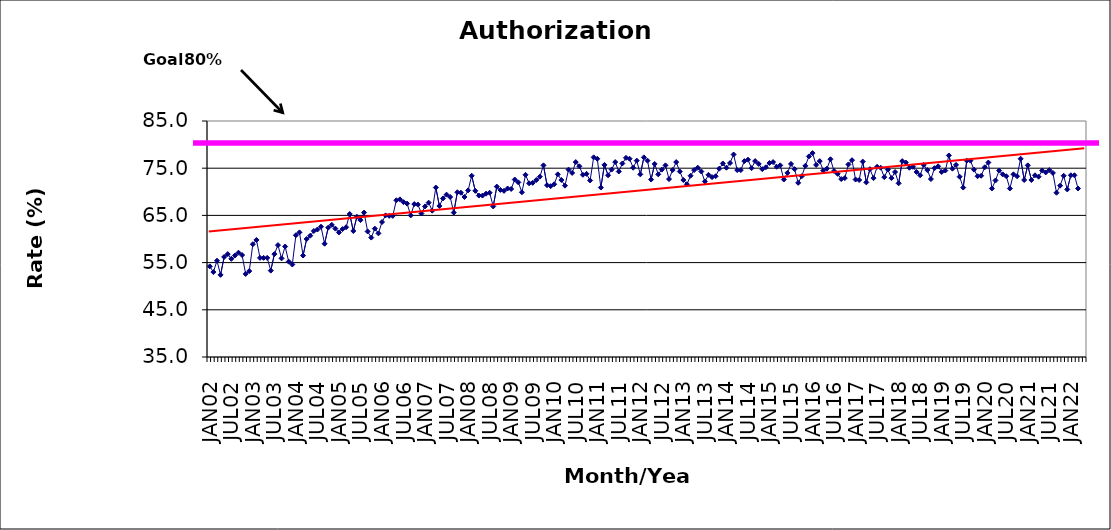
| Category | Series 0 |
|---|---|
| JAN02 | 54.2 |
| FEB02 | 53 |
| MAR02 | 55.4 |
| APR02 | 52.4 |
| MAY02 | 56.2 |
| JUN02 | 56.8 |
| JUL02 | 55.8 |
| AUG02 | 56.5 |
| SEP02 | 57.1 |
| OCT02 | 56.6 |
| NOV02 | 52.6 |
| DEC02 | 53.2 |
| JAN03 | 58.9 |
| FEB03 | 59.8 |
| MAR03 | 56 |
| APR03 | 56 |
| MAY03 | 56 |
| JUN03 | 53.3 |
| JUL03 | 56.8 |
| AUG03 | 58.7 |
| SEP03 | 55.9 |
| OCT03 | 58.4 |
| NOV03 | 55.2 |
| DEC03 | 54.6 |
| JAN04 | 60.8 |
| FEB04 | 61.4 |
| MAR04 | 56.5 |
| APR04 | 60 |
| MAY04 | 60.7 |
| JUN04 | 61.7 |
| JUL04 | 62 |
| AUG04 | 62.6 |
| SEP04 | 59 |
| OCT04 | 62.4 |
| NOV04 | 63 |
| DEC04 | 62.2 |
| JAN05 | 61.4 |
| FEB05 | 62.1 |
| MAR05 | 62.5 |
| APR05 | 65.3 |
| MAY05 | 61.7 |
| JUN05 | 64.7 |
| JUL05 | 64 |
| AUG05 | 65.6 |
| SEP05 | 61.6 |
| OCT05 | 60.3 |
| NOV05 | 62.2 |
| DEC05 | 61.2 |
| JAN06 | 63.6 |
| FEB06 | 65 |
| MAR06 | 64.9 |
| APR06 | 64.9 |
| MAY06 | 68.2 |
| JUN06 | 68.4 |
| JUL06 | 67.8 |
| AUG06 | 67.5 |
| SEP06 | 65 |
| OCT06 | 67.4 |
| NOV06 | 67.3 |
| DEC06 | 65.4 |
| JAN07 | 66.9 |
| FEB07 | 67.7 |
| MAR07 | 66 |
| APR07 | 70.9 |
| MAY07 | 67 |
| JUN07 | 68.6 |
| JUL07 | 69.4 |
| AUG07 | 68.9 |
| SEP07 | 65.6 |
| OCT07 | 69.9 |
| NOV07 | 69.8 |
| DEC07 | 68.9 |
| JAN08 | 70.3 |
| FEB08 | 73.4 |
| MAR08 | 70.2 |
| APR08 | 69.2 |
| MAY08 | 69.2 |
| JUN08 | 69.6 |
| JUL08 | 69.8 |
| AUG08 | 66.9 |
| SEP08 | 71.1 |
| OCT08 | 70.4 |
| NOV08 | 70.2 |
| DEC08 | 70.7 |
| JAN09 | 70.6 |
| FEB09 | 72.6 |
| MAR09 | 72 |
| APR09 | 69.9 |
| MAY09 | 73.6 |
| JUN09 | 71.8 |
| JUL09 | 71.9 |
| AUG09 | 72.5 |
| SEP09 | 73.2 |
| OCT09 | 75.6 |
| NOV09 | 71.4 |
| DEC09 | 71.2 |
| JAN10 | 71.6 |
| FEB10 | 73.7 |
| MAR10 | 72.5 |
| APR10 | 71.3 |
| MAY10 | 74.7 |
| JUN10 | 74 |
| JUL10 | 76.3 |
| AUG10 | 75.4 |
| SEP10 | 73.6 |
| OCT10 | 73.8 |
| NOV10 | 72.4 |
| DEC10 | 77.3 |
| JAN11 | 77 |
| FEB11 | 70.9 |
| MAR11 | 75.7 |
| APR11 | 73.5 |
| MAY11 | 74.7 |
| JUN11 | 76.3 |
| JUL11 | 74.3 |
| AUG11 | 76 |
| SEP11 | 77.2 |
| OCT11 | 77 |
| NOV11 | 75.1 |
| DEC11 | 76.6 |
| JAN12 | 73.7 |
| FEB12 | 77.3 |
| MAR12 | 76.6 |
| APR12 | 72.6 |
| MAY12 | 75.9 |
| JUN12 | 73.7 |
| JUL12 | 74.7 |
| AUG12 | 75.6 |
| SEP12 | 72.7 |
| OCT12 | 74.6 |
| NOV12 | 76.3 |
| DEC12 | 74.3 |
| JAN13 | 72.5 |
| FEB13 | 71.6 |
| MAR13 | 73.4 |
| APR13 | 74.6 |
| MAY13 | 75.1 |
| JUN13 | 74.3 |
| JUL13 | 72.2 |
| AUG13 | 73.6 |
| SEP13 | 73.1 |
| OCT13 | 73.3 |
| NOV13 | 74.9 |
| DEC13 | 76 |
| JAN14 | 75.1 |
| FEB14 | 76.1 |
| MAR14 | 77.9 |
| APR14 | 74.6 |
| MAY14 | 74.6 |
| JUN14 | 76.5 |
| JUL14 | 76.8 |
| AUG14 | 75 |
| SEP14 | 76.5 |
| OCT14 | 75.9 |
| NOV14 | 74.8 |
| DEC14 | 75.2 |
| JAN15 | 76.1 |
| FEB15 | 76.3 |
| MAR15 | 75.3 |
| APR15 | 75.6 |
| MAY15 | 72.6 |
| JUN15 | 74 |
| JUL15 | 75.9 |
| AUG15 | 74.8 |
| SEP15 | 71.9 |
| OCT15 | 73.3 |
| NOV15 | 75.5 |
| DEC15 | 77.5 |
| JAN16 | 78.2 |
| FEB16 | 75.7 |
| MAR16 | 76.5 |
| APR16 | 74.5 |
| MAY16 | 74.9 |
| JUN16 | 76.9 |
| JUL16 | 74.4 |
| AUG16 | 73.8 |
| SEP16 | 72.7 |
| OCT16 | 72.9 |
| NOV16 | 75.8 |
| DEC16 | 76.7 |
| JAN17 | 72.6 |
| FEB17 | 72.5 |
| MAR17 | 76.4 |
| APR17 | 72 |
| MAY17 | 74.8 |
| JUN17 | 72.9 |
| JUL17 | 75.3 |
| AUG17 | 75.1 |
| SEP17 | 73.1 |
| OCT17 | 74.7 |
| NOV17 | 72.9 |
| DEC17 | 74.2 |
| JAN18 | 71.8 |
| FEB18 | 76.5 |
| MAR18 | 76.2 |
| APR18 | 75.1 |
| MAY18 | 75.3 |
| JUN18 | 74.2 |
| JUL18 | 73.5 |
| AUG18 | 75.7 |
| SEP18 | 74.6 |
| OCT18 | 72.7 |
| NOV18 | 75 |
| DEC18 | 75.4 |
| JAN19 | 74.2 |
| FEB19 | 74.5 |
| MAR19 | 77.7 |
| APR19 | 74.9 |
| MAY19 | 75.7 |
| JUN19 | 73.2 |
| JUL19 | 70.9 |
| AUG19 | 76.6 |
| SEP19 | 76.6 |
| OCT19 | 74.7 |
| NOV19 | 73.3 |
| DEC19 | 73.4 |
| JAN20 | 75.2 |
| FEB20 | 76.2 |
| MAR20 | 70.7 |
| APR20 | 72.4 |
| MAY20 | 74.5 |
| JUN20 | 73.7 |
| JUL20 | 73.3 |
| AUG20 | 70.7 |
| SEP20 | 73.7 |
| OCT20 | 73.3 |
| NOV20 | 77 |
| DEC20 | 72.5 |
| JAN21 | 75.6 |
| FEB21 | 72.5 |
| MAR21 | 73.5 |
| APR21 | 73.2 |
| MAY21 | 74.5 |
| JUN21 | 74.1 |
| JUL21 | 74.6 |
| AUG21 | 74 |
| SEP21 | 69.8 |
| OCT21 | 71.3 |
| NOV21 | 73.4 |
| DEC21 | 70.5 |
| JAN22 | 73.5 |
| FEB22 | 73.5 |
| MAR22 | 70.7 |